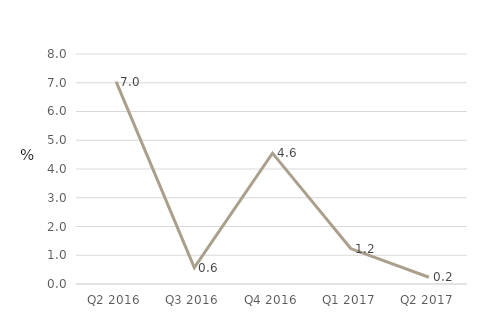
| Category | Financial and insurance activities |
|---|---|
| Q2 2016 | 7.039 |
| Q3 2016 | 0.569 |
| Q4 2016 | 4.551 |
| Q1 2017 | 1.233 |
| Q2 2017 | 0.236 |